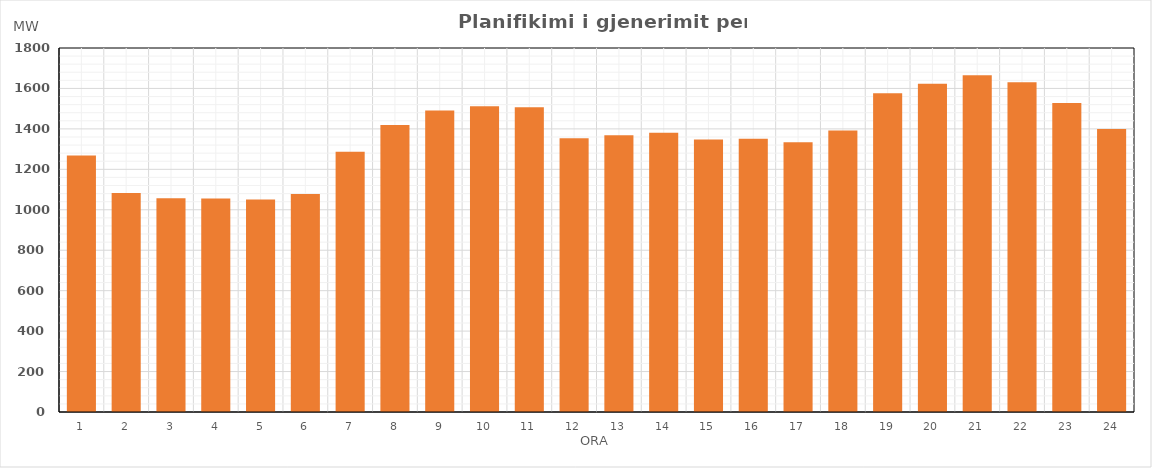
| Category | Max (MW) |
|---|---|
| 0 | 1267.93 |
| 1 | 1083.348 |
| 2 | 1057.247 |
| 3 | 1056.031 |
| 4 | 1050.512 |
| 5 | 1077.998 |
| 6 | 1287.437 |
| 7 | 1418.718 |
| 8 | 1490.783 |
| 9 | 1511.622 |
| 10 | 1507.422 |
| 11 | 1353.248 |
| 12 | 1368.53 |
| 13 | 1381.461 |
| 14 | 1347.682 |
| 15 | 1351.091 |
| 16 | 1333.8 |
| 17 | 1392.38 |
| 18 | 1576.2 |
| 19 | 1623.19 |
| 20 | 1665.02 |
| 21 | 1631.18 |
| 22 | 1528.08 |
| 23 | 1399.07 |